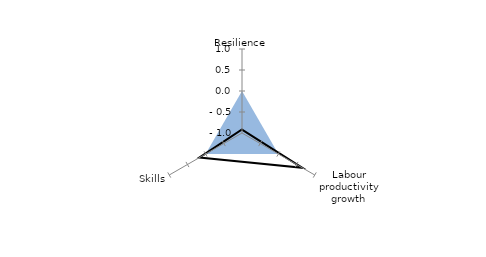
| Category | OECD average | Priority: resilience |
|---|---|---|
| Resilience | 0 | -0.917 |
| Labour productivity
growth | 0 | 0.66 |
| Skills | 0 | 0.172 |